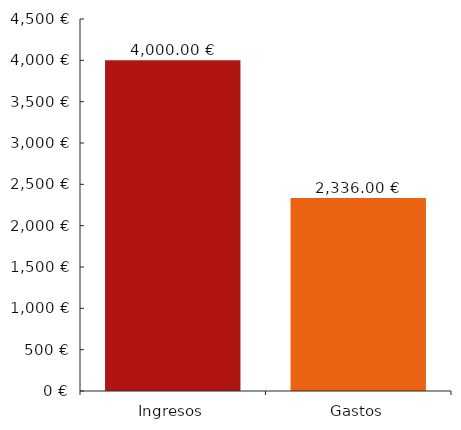
| Category | DatosGráfico |
|---|---|
| 0 | 4000 |
| 1 | 2336 |